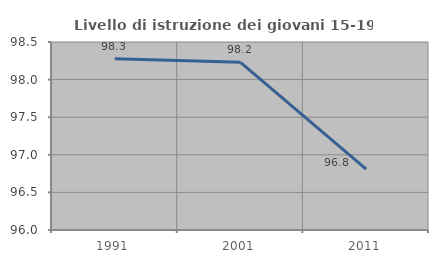
| Category | Livello di istruzione dei giovani 15-19 anni |
|---|---|
| 1991.0 | 98.276 |
| 2001.0 | 98.23 |
| 2011.0 | 96.809 |